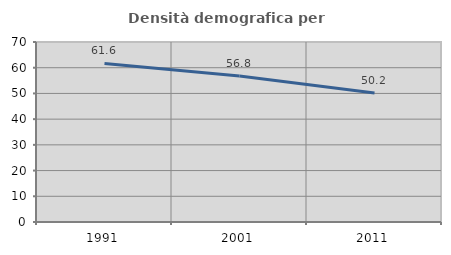
| Category | Densità demografica |
|---|---|
| 1991.0 | 61.65 |
| 2001.0 | 56.793 |
| 2011.0 | 50.183 |